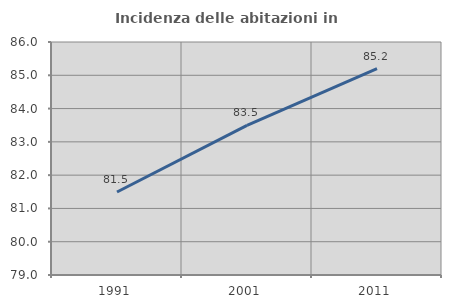
| Category | Incidenza delle abitazioni in proprietà  |
|---|---|
| 1991.0 | 81.494 |
| 2001.0 | 83.495 |
| 2011.0 | 85.197 |